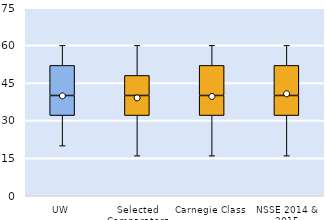
| Category | 25th | 50th | 75th |
|---|---|---|---|
| UW | 32 | 8 | 12 |
| Selected Comparators | 32 | 8 | 8 |
| Carnegie Class | 32 | 8 | 12 |
| NSSE 2014 & 2015 | 32 | 8 | 12 |